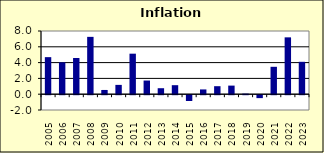
| Category | 2.1 |
|---|---|
| 2005.0 | 4.69 |
| 2006.0 | 4.035 |
| 2007.0 | 4.58 |
| 2008.0 | 7.258 |
| 2009.0 | 0.537 |
| 2010.0 | 1.179 |
| 2011.0 | 5.129 |
| 2012.0 | 1.73 |
| 2013.0 | 0.758 |
| 2014.0 | 1.141 |
| 2015.0 | -0.731 |
| 2016.0 | 0.604 |
| 2017.0 | 1.014 |
| 2018.0 | 1.088 |
| 2019.0 | 0.074 |
| 2020.0 | -0.37 |
| 2021.0 | 3.468 |
| 2022.0 | 7.196 |
| 2023.0 | 4.1 |